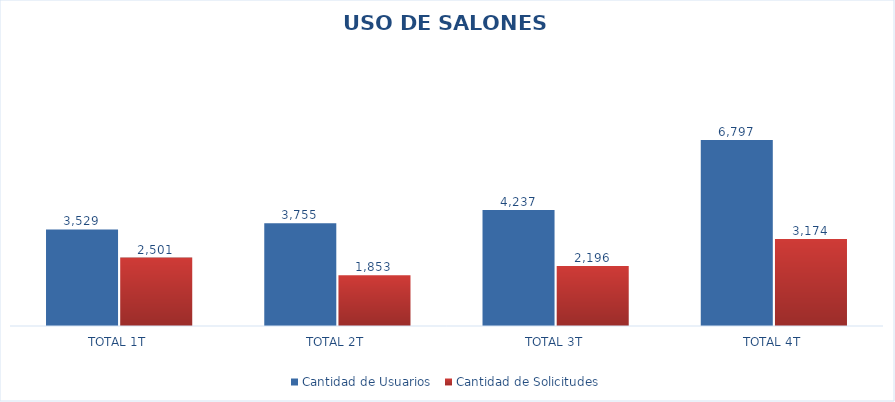
| Category | Cantidad de Usuarios  | Cantidad de Solicitudes |
|---|---|---|
| TOTAL 1T | 3529 | 2501 |
| TOTAL 2T | 3755 | 1853 |
| TOTAL 3T | 4237 | 2196 |
| TOTAL 4T | 6797 | 3174 |